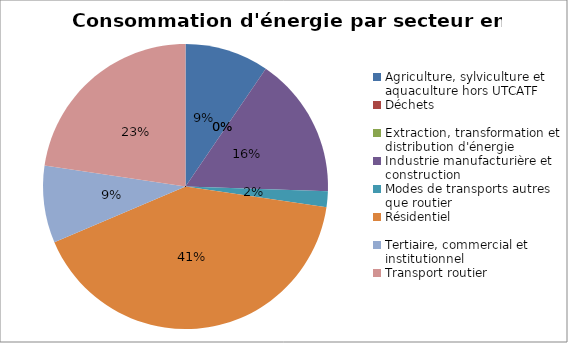
| Category | Series 0 |
|---|---|
| Agriculture, sylviculture et aquaculture hors UTCATF | 97209.205 |
| Déchets | 0 |
| Extraction, transformation et distribution d'énergie | 0 |
| Industrie manufacturière et construction | 163222.17 |
| Modes de transports autres que routier | 18358.149 |
| Résidentiel | 421068.142 |
| Tertiaire, commercial et institutionnel | 89164.06 |
| Transport routier | 231113.032 |